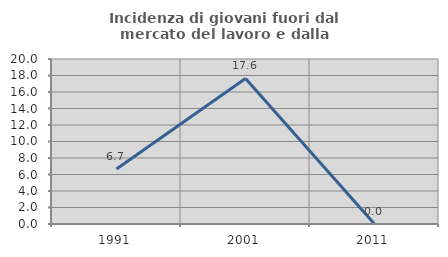
| Category | Incidenza di giovani fuori dal mercato del lavoro e dalla formazione  |
|---|---|
| 1991.0 | 6.667 |
| 2001.0 | 17.647 |
| 2011.0 | 0 |